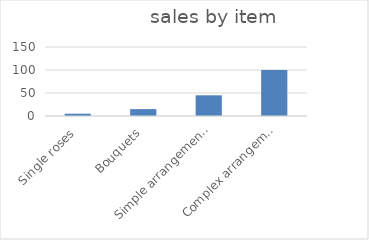
| Category | Series 0 |
|---|---|
|   Single roses | 5 |
|   Bouquets | 15 |
|   Simple arrangements | 45 |
|   Complex arrangements | 100 |